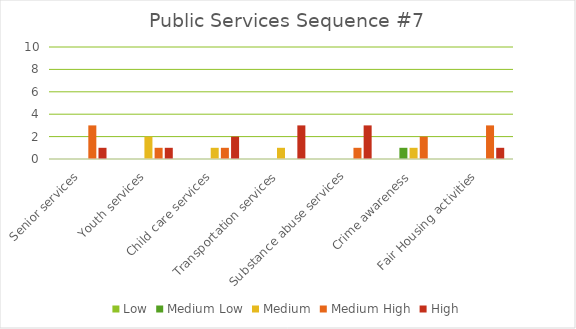
| Category | Low | Medium Low | Medium | Medium High | High |
|---|---|---|---|---|---|
| Senior services | 0 | 0 | 0 | 3 | 1 |
| Youth services | 0 | 0 | 2 | 1 | 1 |
| Child care services | 0 | 0 | 1 | 1 | 2 |
| Transportation services | 0 | 0 | 1 | 0 | 3 |
| Substance abuse services | 0 | 0 | 0 | 1 | 3 |
| Crime awareness | 0 | 1 | 1 | 2 | 0 |
| Fair Housing activities | 0 | 0 | 0 | 3 | 1 |